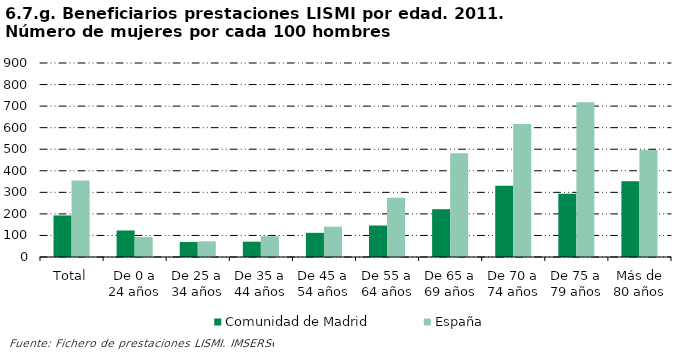
| Category | Comunidad de Madrid | España |
|---|---|---|
| Total | 192.66 | 355.387 |
| De 0 a 24 años | 123.077 | 92.941 |
| De 25 a 34 años | 69.492 | 72.876 |
| De 35 a 44 años | 71.074 | 96.537 |
| De 45 a 54 años | 112.139 | 140.493 |
| De 55 a 64 años | 146.111 | 274.886 |
| De 65 a 69 años | 221.795 | 481.622 |
| De 70 a 74 años | 330.769 | 616.953 |
| De 75 a 79 años | 293.137 | 717.518 |
| Más de 80 años | 351.678 | 496.854 |